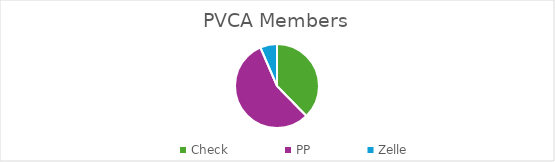
| Category | Series 0 |
|---|---|
| Check | 29 |
| PP | 43 |
| Zelle | 5 |